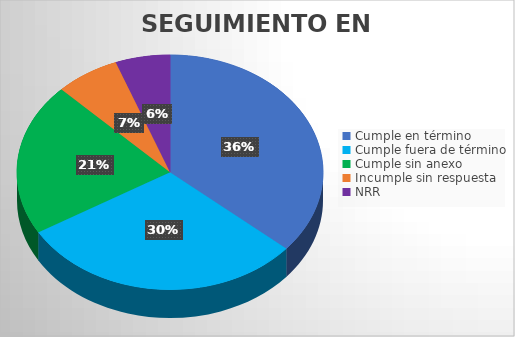
| Category | TOTAL |
|---|---|
| Cumple en término | 107 |
| Cumple fuera de término | 89 |
| Cumple sin anexo | 62 |
| Incumple sin respuesta | 20 |
| NRR | 17 |